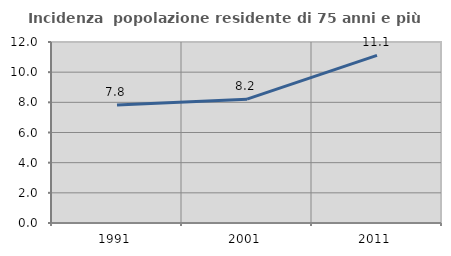
| Category | Incidenza  popolazione residente di 75 anni e più |
|---|---|
| 1991.0 | 7.819 |
| 2001.0 | 8.212 |
| 2011.0 | 11.111 |